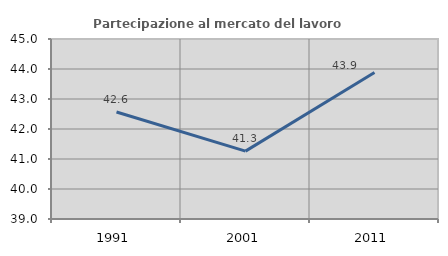
| Category | Partecipazione al mercato del lavoro  femminile |
|---|---|
| 1991.0 | 42.567 |
| 2001.0 | 41.263 |
| 2011.0 | 43.883 |